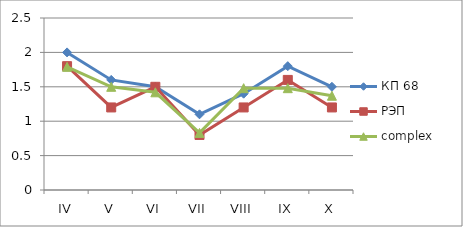
| Category | КП 68 | РЭП  | complex |
|---|---|---|---|
| IV | 2 | 1.8 | 1.79 |
| V | 1.6 | 1.2 | 1.5 |
| VI | 1.5 | 1.5 | 1.42 |
| VII | 1.1 | 0.8 | 0.83 |
| VIII | 1.4 | 1.2 | 1.48 |
| IX | 1.8 | 1.6 | 1.48 |
| X | 1.5 | 1.2 | 1.37 |